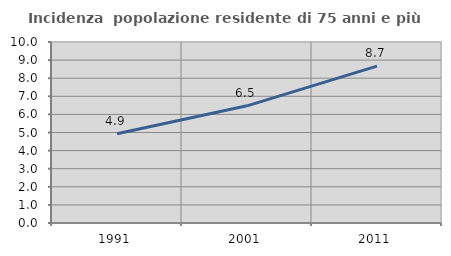
| Category | Incidenza  popolazione residente di 75 anni e più |
|---|---|
| 1991.0 | 4.934 |
| 2001.0 | 6.473 |
| 2011.0 | 8.667 |